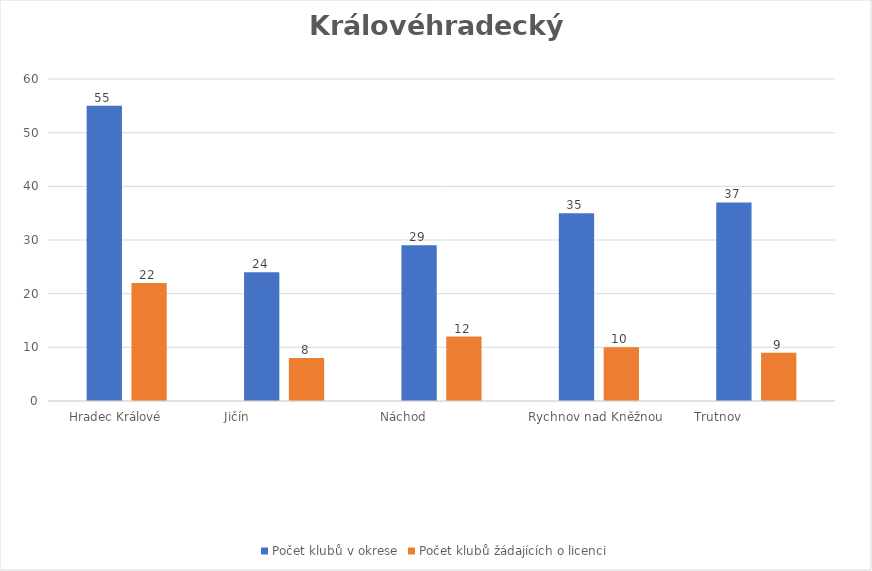
| Category | Počet klubů v okrese | Počet klubů žádajících o licenci |
|---|---|---|
| Hradec Králové      | 55 | 22 |
| Jičín                         | 24 | 8 |
| Náchod                    | 29 | 12 |
| Rychnov nad Kněžnou  | 35 | 10 |
| Trutnov                    | 37 | 9 |